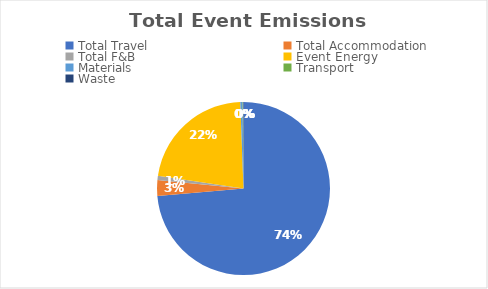
| Category | Series 0 |
|---|---|
| Total Travel | 8.67 |
| Total Accommodation | 0.35 |
| Total F&B | 0.09 |
| Event Energy | 2.6 |
| Materials | 0.05 |
| Transport | 0.01 |
| Waste | 0.01 |